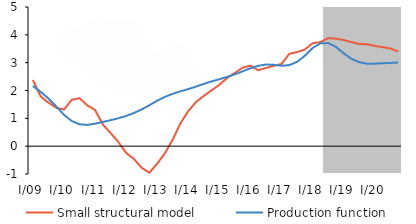
| Category | Small structural model | Production function |
|---|---|---|
| I/09 | 2.381 | 2.158 |
| II | 1.784 | 1.954 |
| III | 1.565 | 1.712 |
| IV | 1.382 | 1.43 |
| I/10 | 1.314 | 1.126 |
| II | 1.665 | 0.904 |
| III | 1.721 | 0.787 |
| IV | 1.467 | 0.763 |
| I/11 | 1.301 | 0.807 |
| II | 0.781 | 0.869 |
| III | 0.472 | 0.933 |
| IV | 0.147 | 1.002 |
| I/12 | -0.24 | 1.085 |
| II | -0.459 | 1.191 |
| III | -0.779 | 1.32 |
| IV | -0.952 | 1.471 |
| I/13 | -0.624 | 1.634 |
| II | -0.253 | 1.772 |
| III | 0.24 | 1.882 |
| IV | 0.827 | 1.971 |
| I/14 | 1.258 | 2.051 |
| II | 1.59 | 2.142 |
| III | 1.807 | 2.238 |
| IV | 2.007 | 2.328 |
| I/15 | 2.202 | 2.406 |
| II | 2.453 | 2.489 |
| III | 2.632 | 2.582 |
| IV | 2.82 | 2.689 |
| I/16 | 2.892 | 2.801 |
| II | 2.729 | 2.888 |
| III | 2.811 | 2.932 |
| IV | 2.887 | 2.926 |
| I/17 | 2.954 | 2.888 |
| II | 3.317 | 2.912 |
| III | 3.381 | 3.03 |
| IV | 3.474 | 3.248 |
| I/18 | 3.697 | 3.527 |
| II | 3.741 | 3.693 |
| III | 3.879 | 3.704 |
| IV | 3.863 | 3.569 |
| I/19 | 3.813 | 3.333 |
| II | 3.742 | 3.137 |
| III | 3.669 | 3.016 |
| IV | 3.662 | 2.965 |
| I/20 | 3.602 | 2.965 |
| II | 3.557 | 2.978 |
| III | 3.507 | 2.991 |
| IV | 3.406 | 3.007 |